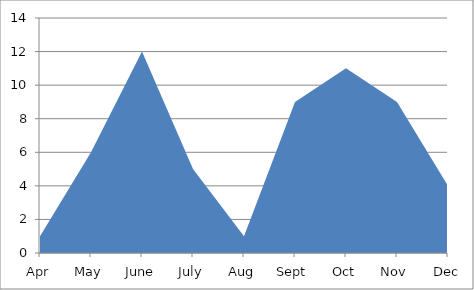
| Category | Series 0 |
|---|---|
| Apr | 1 |
| May | 6 |
| June | 12 |
| July | 5 |
| Aug | 1 |
| Sept | 9 |
| Oct | 11 |
| Nov | 9 |
| Dec | 4 |